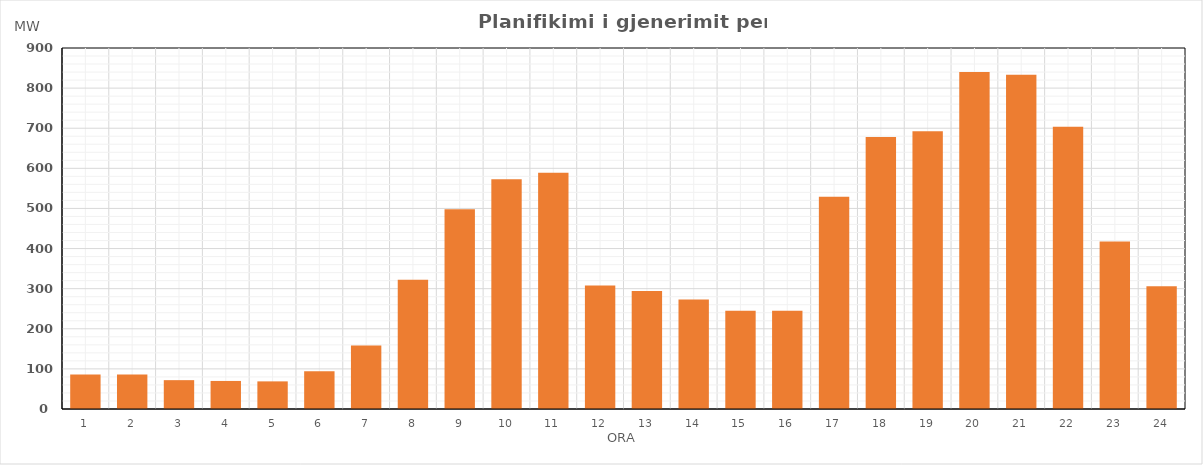
| Category | Max (MW) |
|---|---|
| 0 | 86.019 |
| 1 | 85.969 |
| 2 | 71.917 |
| 3 | 69.939 |
| 4 | 68.859 |
| 5 | 93.854 |
| 6 | 158.224 |
| 7 | 322.235 |
| 8 | 498.185 |
| 9 | 572.691 |
| 10 | 588.767 |
| 11 | 308.091 |
| 12 | 293.961 |
| 13 | 273.066 |
| 14 | 244.716 |
| 15 | 244.775 |
| 16 | 529.3 |
| 17 | 678.414 |
| 18 | 692.451 |
| 19 | 840.219 |
| 20 | 833.046 |
| 21 | 703.408 |
| 22 | 417.9 |
| 23 | 305.9 |